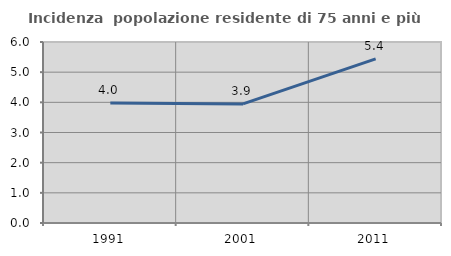
| Category | Incidenza  popolazione residente di 75 anni e più |
|---|---|
| 1991.0 | 3.979 |
| 2001.0 | 3.948 |
| 2011.0 | 5.44 |